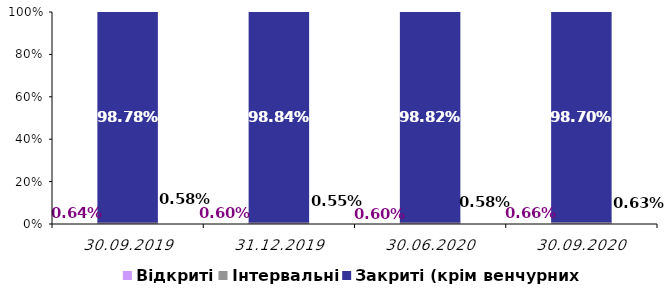
| Category | Відкриті | Інтервальні | Закриті (крім венчурних) |
|---|---|---|---|
| 30.09.2019 | 0.006 | 0.006 | 0.988 |
| 31.12.2019 | 0.006 | 0.006 | 0.988 |
| 30.06.2020 | 0.006 | 0.006 | 0.988 |
| 30.09.2020 | 0.007 | 0.006 | 0.987 |